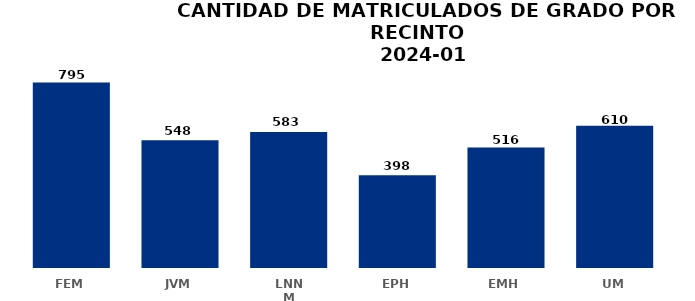
| Category | Series 0 |
|---|---|
| FEM | 795 |
| JVM | 548 |
| LNNM | 583 |
| EPH | 398 |
| EMH | 516 |
| UM | 610 |